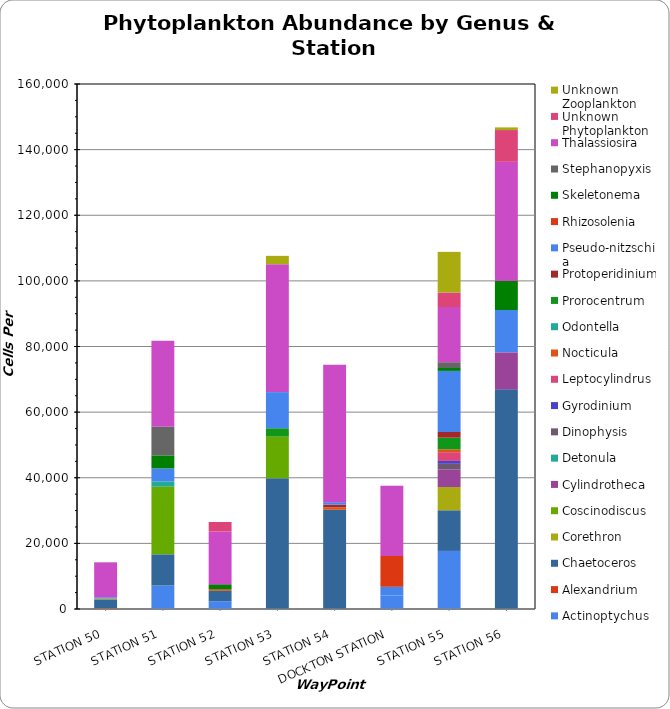
| Category | Actinoptychus | Alexandrium | Amphidinium | Amylax | Asterionella | Asteromphalus | Cerataulina | Ceratium | Chaetoceros | Choanoflagellates | Corethron | Coscinodiscus | Cryptomonads | Cylindrotheca | Dactyliosolen | Detonula | Dictyocha | Dinophysis | Ditylum | Ebria | Eucampia | Euglenoids | Gonyaulax | Guinardia | Gymnodinium | Gyrodinium | Gyro-Pleuro-sigma | Heterocapsa | Lauderia | Leptocylindrus | Meringosphaera | Minuscula | Navicula | Nitzschia | Nocticula | Odontella | Paralia | Phaeocystis | Prorocentrum | Protoperidinium | Pseudo-nitzschia | Rhizosolenia | Scrippsiella | Skeletonema | Stephanopyxis | Thalassionema | Thalassiosira | Tropidoneis | Unidentified pennates | Unknown Phytoplankton | Unknown Zooplankton | Ciliate* Heliocostomella | Ciliate* Laboea | Ciliate* Salpingella | Ciliate* Tiarina |
|---|---|---|---|---|---|---|---|---|---|---|---|---|---|---|---|---|---|---|---|---|---|---|---|---|---|---|---|---|---|---|---|---|---|---|---|---|---|---|---|---|---|---|---|---|---|---|---|---|---|---|---|---|---|---|---|
| STATION 50 | 0 | 256 |  |  |  |  |  |  | 2692 |  | 128 | 0 |  | 0 |  | 0 |  | 0 |  |  |  |  |  |  |  | 0 |  |  |  | 0 |  |  |  |  | 128 | 128 |  |  | 0 | 0 | 256 | 0 |  | 0 | 0 |  | 10641 |  |  | 0 | 0 |  |  |  |  |
| STATION 51 | 7142 | 0 |  |  |  |  |  |  | 9523 |  | 0 | 20634 |  | 0 |  | 1587 |  | 0 |  |  |  |  |  |  |  | 0 |  |  |  | 0 |  |  |  |  | 0 | 0 |  |  | 0 | 0 | 3968 | 0 |  | 3968 | 8730 |  | 26190 |  |  | 0 | 0 |  |  |  |  |
| STATION 52 | 2362 | 0 |  |  |  |  |  |  | 3149 |  | 0 | 0 |  | 0 |  | 0 |  | 0 |  |  |  |  |  |  |  | 0 |  |  |  | 0 |  |  |  |  | 262 | 0 |  |  | 0 | 0 | 0 | 262 |  | 1312 | 262 |  | 16010 |  |  | 2887 | 0 |  |  |  |  |
| STATION 53 | 0 | 0 |  |  |  |  |  |  | 39830 |  | 0 | 12711 |  | 0 |  | 0 |  | 0 |  |  |  |  |  |  |  | 0 |  |  |  | 0 |  |  |  |  | 0 | 0 |  |  | 2542 | 0 | 11016 | 0 |  | 0 | 0 |  | 38983 |  |  | 0 | 2542 |  |  |  |  |
| STATION 54 | 0 | 0 |  |  |  |  |  |  | 30232 |  | 0 | 0 |  | 0 |  | 0 |  | 0 |  |  |  |  |  |  |  | 0 |  |  |  | 0 |  |  |  |  | 775 | 0 |  |  | 0 | 775 | 775 | 0 |  | 0 | 0 |  | 41860 |  |  | 0 | 0 |  |  |  |  |
| DOCKTON STATION | 4135 | 0 |  |  |  |  |  |  | 0 |  | 0 | 0 |  | 0 |  | 0 |  | 0 |  |  |  |  |  |  |  | 0 |  |  |  | 0 |  |  |  |  | 0 | 0 |  |  | 0 | 0 | 2631 | 9398 |  | 0 | 0 |  | 21428 |  |  | 0 | 0 |  |  |  |  |
| STATION 55 | 17699 | 0 |  |  |  |  |  |  | 12389 |  | 7079 | 0 |  | 5309 |  | 0 |  | 1769 |  |  |  |  |  |  |  | 884 |  |  |  | 2654 |  |  |  |  | 884 | 0 |  |  | 3539 | 1769 | 18584 | 0 |  | 884 | 1769 |  | 16814 |  |  | 4424 | 12389 |  |  |  |  |
| STATION 56 | 0 | 0 |  |  |  |  |  |  | 66935 |  | 0 | 0 |  | 11290 |  | 0 |  | 0 |  |  |  |  |  |  |  | 0 |  |  |  | 0 |  |  |  |  | 0 | 0 |  |  | 0 | 0 | 12903 | 0 |  | 8870 | 0 |  | 36290 |  |  | 9677 | 806 |  |  |  |  |